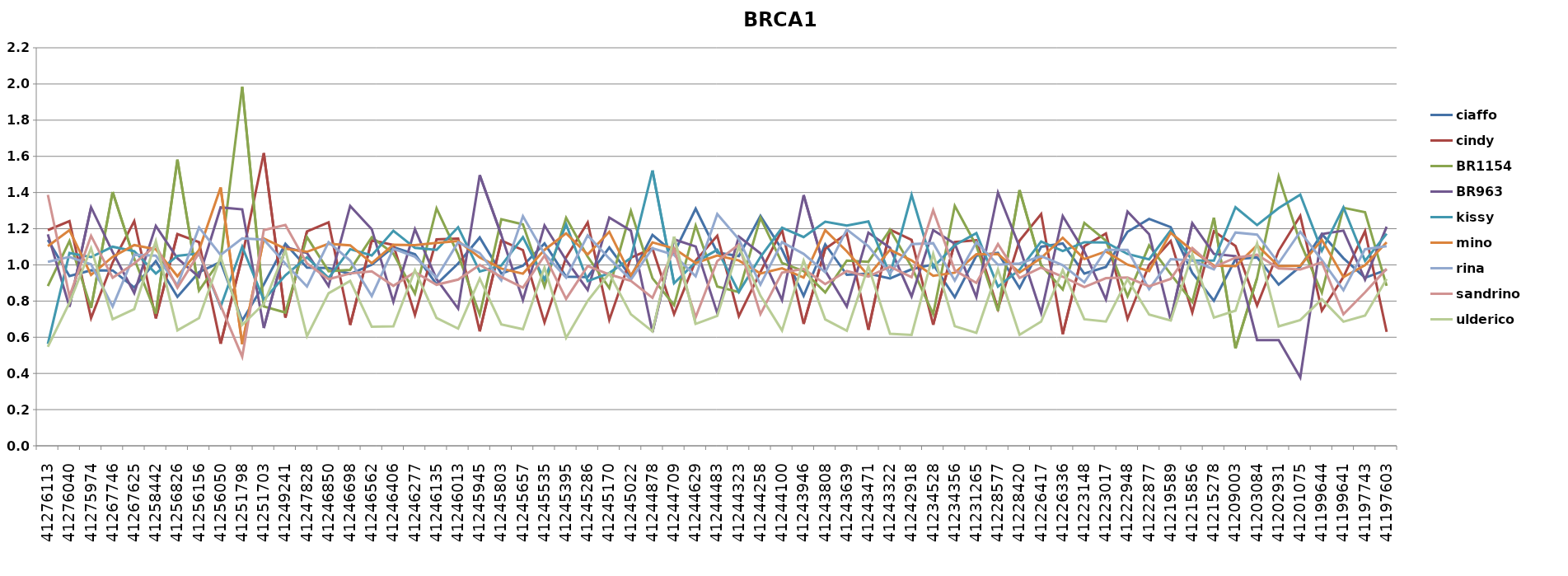
| Category | ciaffo | cindy | BR1154 | BR963 | kissy | mino | rina | sandrino | ulderico |
|---|---|---|---|---|---|---|---|---|---|
| 41276113.0 | 1.138 | 1.192 | 0.883 | 1.169 | 0.563 | 1.104 | 1.017 | 1.387 | 0.547 |
| 41276040.0 | 0.938 | 1.242 | 1.132 | 0.769 | 1.065 | 1.192 | 1.044 | 0.827 | 0.791 |
| 41275974.0 | 0.97 | 0.705 | 0.762 | 1.319 | 1.043 | 0.945 | 1.003 | 1.161 | 1.092 |
| 41267746.0 | 0.969 | 1.013 | 1.403 | 1.071 | 1.1 | 1.044 | 0.77 | 0.929 | 0.7 |
| 41267625.0 | 0.875 | 1.242 | 1.034 | 0.845 | 1.076 | 1.11 | 1.056 | 1.008 | 0.756 |
| 41258442.0 | 1.021 | 0.704 | 0.731 | 1.216 | 0.953 | 1.086 | 1.051 | 1.108 | 1.131 |
| 41256826.0 | 0.824 | 1.17 | 1.582 | 1.036 | 1.05 | 0.937 | 0.888 | 0.874 | 0.638 |
| 41256156.0 | 0.96 | 1.125 | 0.858 | 0.933 | 1.063 | 1.082 | 1.207 | 1.066 | 0.706 |
| 41256050.0 | 1.017 | 0.564 | 1.029 | 1.318 | 0.768 | 1.428 | 1.055 | 0.775 | 1.045 |
| 41251798.0 | 0.692 | 1.046 | 1.984 | 1.307 | 1.101 | 0.562 | 1.147 | 0.493 | 0.668 |
| 41251703.0 | 0.891 | 1.618 | 0.77 | 0.651 | 0.806 | 1.146 | 1.14 | 1.192 | 0.785 |
| 41249241.0 | 1.117 | 0.709 | 0.737 | 1.098 | 0.943 | 1.089 | 1.006 | 1.22 | 1.081 |
| 41247828.0 | 0.985 | 1.185 | 1.154 | 1.066 | 1.042 | 1.072 | 0.88 | 1.008 | 0.606 |
| 41246850.0 | 0.983 | 1.235 | 0.965 | 0.883 | 0.927 | 1.116 | 1.126 | 0.921 | 0.843 |
| 41246698.0 | 0.951 | 0.668 | 0.973 | 1.326 | 1.087 | 1.108 | 1.024 | 0.953 | 0.911 |
| 41246562.0 | 1.001 | 1.137 | 1.153 | 1.197 | 1.052 | 1.01 | 0.828 | 0.965 | 0.658 |
| 41246406.0 | 1.098 | 1.111 | 1.062 | 0.796 | 1.189 | 1.111 | 1.089 | 0.884 | 0.66 |
| 41246277.0 | 1.058 | 0.724 | 0.841 | 1.197 | 1.094 | 1.11 | 1.045 | 0.96 | 0.971 |
| 41246135.0 | 0.893 | 1.141 | 1.312 | 0.921 | 1.083 | 1.122 | 0.93 | 0.89 | 0.707 |
| 41246013.0 | 1.008 | 1.146 | 1.057 | 0.758 | 1.208 | 1.132 | 1.125 | 0.919 | 0.648 |
| 41245945.0 | 1.152 | 0.633 | 0.724 | 1.496 | 0.964 | 1.041 | 1.065 | 1 | 0.924 |
| 41245803.0 | 0.953 | 1.135 | 1.252 | 1.164 | 0.997 | 0.98 | 0.915 | 0.933 | 0.671 |
| 41245657.0 | 0.996 | 1.082 | 1.224 | 0.805 | 1.153 | 0.951 | 1.27 | 0.874 | 0.644 |
| 41245535.0 | 1.118 | 0.682 | 0.881 | 1.218 | 0.919 | 1.083 | 1.061 | 1.052 | 0.986 |
| 41245395.0 | 0.935 | 1.041 | 1.26 | 1.026 | 1.224 | 1.174 | 0.929 | 0.812 | 0.597 |
| 41245286.0 | 0.933 | 1.234 | 1.045 | 0.861 | 0.911 | 1.057 | 1.163 | 0.993 | 0.802 |
| 41245170.0 | 1.096 | 0.696 | 0.872 | 1.262 | 0.955 | 1.183 | 1.035 | 0.947 | 0.953 |
| 41245022.0 | 0.934 | 1.04 | 1.298 | 1.189 | 1.039 | 0.943 | 0.919 | 0.912 | 0.727 |
| 41244878.0 | 1.166 | 1.091 | 0.926 | 0.629 | 1.522 | 1.124 | 1.092 | 0.818 | 0.632 |
| 41244709.0 | 1.067 | 0.728 | 0.778 | 1.141 | 0.898 | 1.09 | 1.055 | 1.086 | 1.157 |
| 41244629.0 | 1.311 | 1.023 | 1.218 | 1.102 | 1.015 | 1.01 | 0.937 | 0.711 | 0.674 |
| 41244483.0 | 1.068 | 1.161 | 0.881 | 0.734 | 1.084 | 1.052 | 1.281 | 1.021 | 0.718 |
| 41244323.0 | 1.049 | 0.716 | 0.849 | 1.157 | 0.85 | 1.024 | 1.141 | 1.113 | 1.101 |
| 41244258.0 | 1.271 | 0.96 | 1.26 | 1.064 | 1.044 | 0.953 | 0.891 | 0.728 | 0.83 |
| 41244100.0 | 1.084 | 1.194 | 1.01 | 0.805 | 1.205 | 0.981 | 1.126 | 0.957 | 0.637 |
| 41243946.0 | 0.829 | 0.674 | 0.966 | 1.386 | 1.154 | 0.93 | 1.061 | 0.978 | 1.024 |
| 41243808.0 | 1.114 | 1.089 | 0.848 | 0.968 | 1.239 | 1.192 | 0.959 | 0.894 | 0.699 |
| 41243639.0 | 0.945 | 1.173 | 1.024 | 0.77 | 1.217 | 1.075 | 1.195 | 0.966 | 0.636 |
| 41243471.0 | 0.952 | 0.641 | 1.017 | 1.178 | 1.24 | 0.941 | 1.103 | 0.935 | 0.992 |
| 41243322.0 | 0.925 | 1.194 | 1.194 | 1.094 | 0.945 | 1.084 | 0.953 | 0.99 | 0.62 |
| 41242918.0 | 0.976 | 1.138 | 0.989 | 0.826 | 1.387 | 1.024 | 1.115 | 0.932 | 0.613 |
| 41234528.0 | 1.002 | 0.669 | 0.728 | 1.192 | 0.987 | 0.94 | 1.12 | 1.302 | 1.061 |
| 41234356.0 | 0.821 | 1.126 | 1.326 | 1.117 | 1.109 | 0.957 | 0.913 | 0.97 | 0.661 |
| 41231265.0 | 1.051 | 1.136 | 1.106 | 0.822 | 1.175 | 1.059 | 1.126 | 0.901 | 0.625 |
| 41228577.0 | 1.067 | 0.757 | 0.746 | 1.4 | 0.88 | 1.06 | 1.001 | 1.115 | 0.974 |
| 41228420.0 | 0.872 | 1.134 | 1.413 | 1.099 | 0.973 | 0.958 | 1.008 | 0.928 | 0.614 |
| 41226417.0 | 1.1 | 1.281 | 0.997 | 0.734 | 1.129 | 1.038 | 1.049 | 0.985 | 0.687 |
| 41226336.0 | 1.119 | 0.617 | 0.864 | 1.27 | 1.077 | 1.15 | 0.998 | 0.935 | 0.971 |
| 41223148.0 | 0.952 | 1.103 | 1.231 | 1.074 | 1.126 | 1.033 | 0.903 | 0.878 | 0.7 |
| 41223017.0 | 0.989 | 1.173 | 1.133 | 0.809 | 1.124 | 1.074 | 1.083 | 0.927 | 0.687 |
| 41222948.0 | 1.183 | 0.701 | 0.826 | 1.295 | 1.06 | 1.001 | 1.082 | 0.93 | 0.921 |
| 41222877.0 | 1.254 | 1 | 1.108 | 1.17 | 1.031 | 0.965 | 0.865 | 0.882 | 0.725 |
| 41219589.0 | 1.209 | 1.132 | 0.949 | 0.696 | 1.191 | 1.177 | 1.032 | 0.923 | 0.693 |
| 41215856.0 | 0.955 | 0.737 | 0.795 | 1.231 | 1.025 | 1.08 | 1.025 | 1.094 | 1.059 |
| 41215278.0 | 0.802 | 1.185 | 1.261 | 1.061 | 1.023 | 0.996 | 0.976 | 0.988 | 0.709 |
| 41209003.0 | 1.032 | 1.104 | 0.538 | 1.049 | 1.319 | 0.993 | 1.179 | 1.04 | 0.747 |
| 41203084.0 | 1.041 | 0.776 | 0.928 | 0.585 | 1.22 | 1.109 | 1.167 | 1.056 | 1.119 |
| 41202931.0 | 0.891 | 1.078 | 1.489 | 0.584 | 1.314 | 0.993 | 1.01 | 0.981 | 0.66 |
| 41201075.0 | 0.991 | 1.271 | 1.123 | 0.378 | 1.389 | 0.995 | 1.183 | 0.975 | 0.695 |
| 41199644.0 | 1.17 | 0.747 | 0.846 | 1.17 | 1.078 | 1.138 | 1.026 | 1.014 | 0.81 |
| 41199641.0 | 1.037 | 0.933 | 1.316 | 1.19 | 1.318 | 0.933 | 0.86 | 0.728 | 0.686 |
| 41197743.0 | 0.929 | 1.186 | 1.291 | 0.918 | 1.022 | 0.999 | 1.087 | 0.848 | 0.72 |
| 41197603.0 | 0.973 | 0.63 | 0.884 | 1.211 | 1.173 | 1.125 | 1.103 | 0.979 | 0.923 |